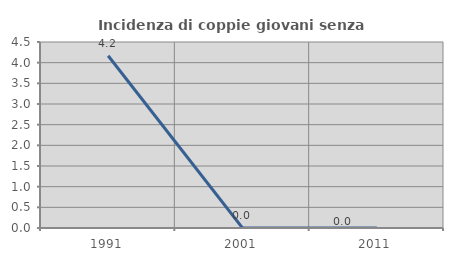
| Category | Incidenza di coppie giovani senza figli |
|---|---|
| 1991.0 | 4.167 |
| 2001.0 | 0 |
| 2011.0 | 0 |